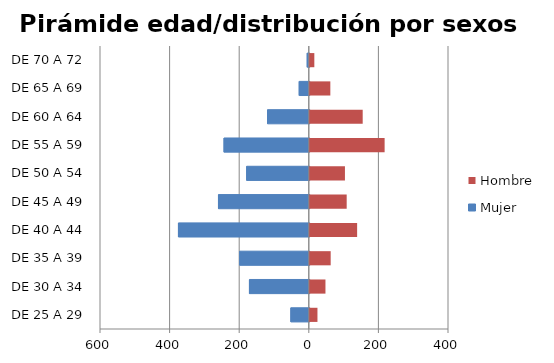
| Category | Mujer | Hombre |
|---|---|---|
| DE 25 A 29 | -53 | 22 |
| DE 30 A 34 | -172 | 45 |
| DE 35 A 39 | -200 | 60 |
| DE 40 A 44 | -376 | 136 |
| DE 45 A 49 | -261 | 106 |
| DE 50 A 54 | -180 | 101 |
| DE 55 A 59 | -245 | 215 |
| DE 60 A 64 | -120 | 152 |
| DE 65 A 69 | -29 | 59 |
| DE 70 A 72 | -6 | 13 |